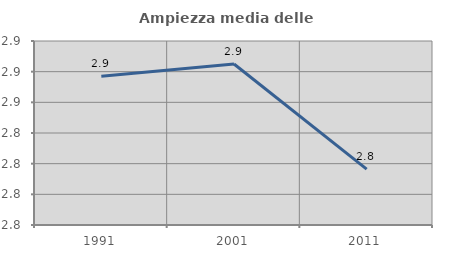
| Category | Ampiezza media delle famiglie |
|---|---|
| 1991.0 | 2.877 |
| 2001.0 | 2.885 |
| 2011.0 | 2.816 |